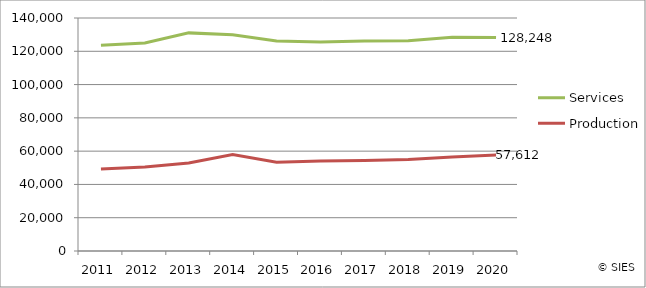
| Category | Services | Production |
|---|---|---|
| 2011.0 | 123667 | 49260 |
| 2012.0 | 124964 | 50458 |
| 2013.0 | 131060 | 52834 |
| 2014.0 | 129897 | 57973 |
| 2015.0 | 126242 | 53369 |
| 2016.0 | 125577 | 54031 |
| 2017.0 | 126235 | 54364 |
| 2018.0 | 126351 | 54962 |
| 2019.0 | 128400 | 56534 |
| 2020.0 | 128248 | 57612 |